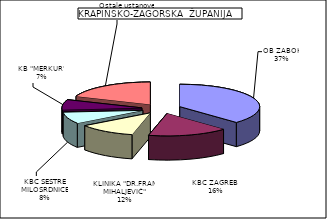
| Category | Series 0 |
|---|---|
| OB ZABOK | 37.465 |
| KBC ZAGREB  | 16.23 |
| KLINIKA "DR.FRAN MIHALJEVIĆ" | 11.621 |
| KBC SESTRE MILOSRDNICE | 8.402 |
| KB "MERKUR" | 7.255 |
| Ostale ustanove | 19.028 |